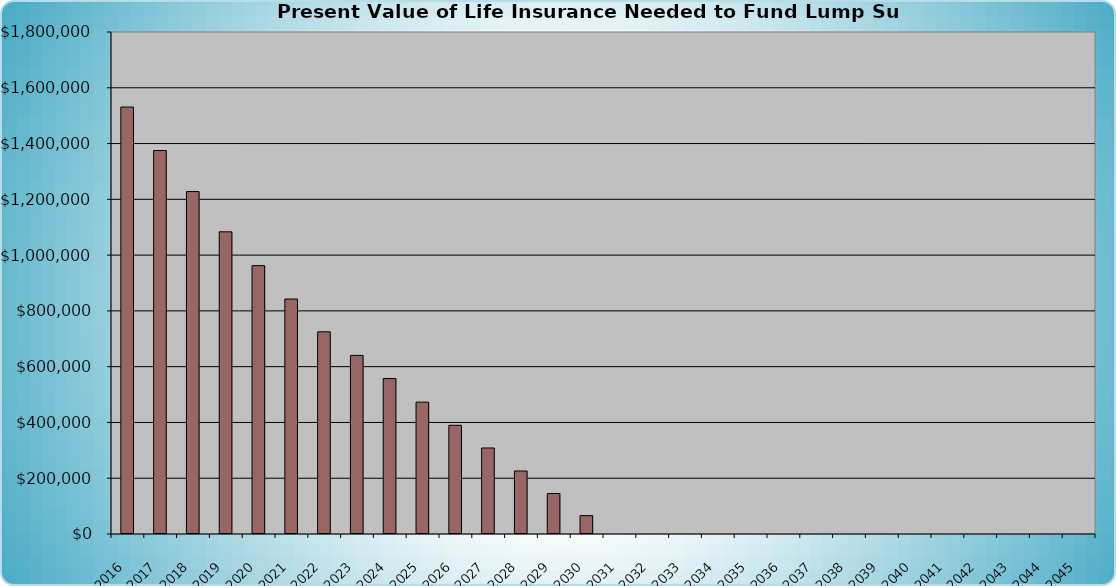
| Category | Present Value of Life Insurance Needed to Fund Income Replacement |
|---|---|
| 2016.0 | 1530932.629 |
| 2017.0 | 1374932.629 |
| 2018.0 | 1227817.244 |
| 2019.0 | 1083531.001 |
| 2020.0 | 962254.829 |
| 2021.0 | 842484.52 |
| 2022.0 | 725017.486 |
| 2023.0 | 640397.128 |
| 2024.0 | 557404.085 |
| 2025.0 | 472777.974 |
| 2026.0 | 389779.287 |
| 2027.0 | 308376.73 |
| 2028.0 | 225990.075 |
| 2029.0 | 145187.78 |
| 2030.0 | 65939.375 |
| 2031.0 | 0 |
| 2032.0 | 0 |
| 2033.0 | 0 |
| 2034.0 | 0 |
| 2035.0 | 0 |
| 2036.0 | 0 |
| 2037.0 | 0 |
| 2038.0 | 0 |
| 2039.0 | 0 |
| 2040.0 | 0 |
| 2041.0 | 0 |
| 2042.0 | 0 |
| 2043.0 | 0 |
| 2044.0 | 0 |
| 2045.0 | 0 |